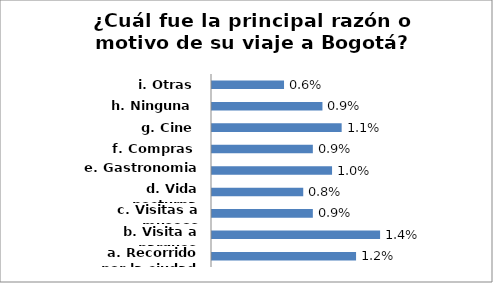
| Category | % Sí |
|---|---|
| a. Recorrido por la ciudad | 0.012 |
| b. Visita a parques | 0.014 |
| c. Visitas a museos | 0.009 |
| d. Vida nocturna | 0.008 |
| e. Gastronomia | 0.01 |
| f. Compras | 0.009 |
| g. Cine | 0.011 |
| h. Ninguna | 0.009 |
| i. Otras | 0.006 |